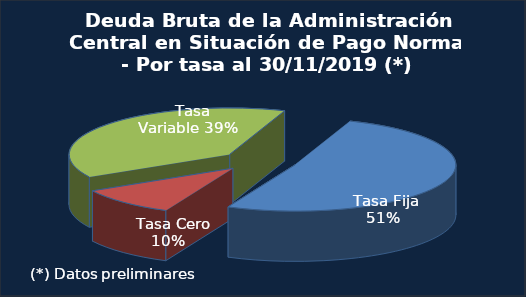
| Category | Series 0 |
|---|---|
|   Tasa Fija | 158405.1 |
|   Tasa Cero | 31048.9 |
|   Tasa Variable | 119311.5 |